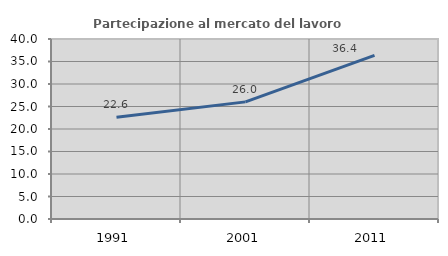
| Category | Partecipazione al mercato del lavoro  femminile |
|---|---|
| 1991.0 | 22.594 |
| 2001.0 | 26.027 |
| 2011.0 | 36.364 |